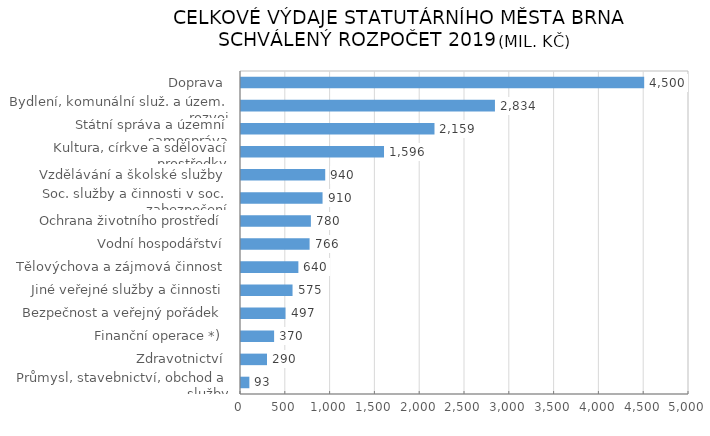
| Category | Series 0 |
|---|---|
|  Průmysl, stavebnictví, obchod a služby | 93.277 |
|  Zdravotnictví | 290.434 |
|  Finanční operace *) | 369.567 |
|  Bezpečnost a veřejný pořádek | 496.691 |
|  Jiné veřejné služby a činnosti | 575.266 |
|  Tělovýchova a zájmová činnost | 640.352 |
|  Vodní hospodářství | 765.517 |
|  Ochrana životního prostředí | 780.041 |
|  Soc. služby a činnosti v soc. zabezpečení | 910.293 |
|  Vzdělávání a školské služby | 940.007 |
|  Kultura, církve a sdělovací prostředky | 1596.146 |
|  Státní správa a územní samospráva | 2159.438 |
|  Bydlení, komunální služ. a územ. rozvoj | 2834.306 |
|  Doprava | 4499.875 |